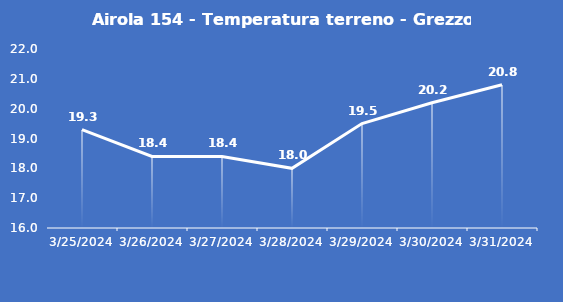
| Category | Airola 154 - Temperatura terreno - Grezzo (°C) |
|---|---|
| 3/25/24 | 19.3 |
| 3/26/24 | 18.4 |
| 3/27/24 | 18.4 |
| 3/28/24 | 18 |
| 3/29/24 | 19.5 |
| 3/30/24 | 20.2 |
| 3/31/24 | 20.8 |